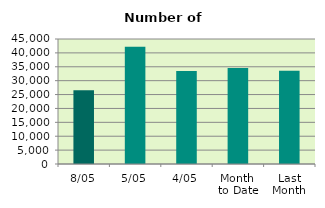
| Category | Series 0 |
|---|---|
| 8/05 | 26560 |
| 5/05 | 42244 |
| 4/05 | 33500 |
| Month 
to Date | 34549.2 |
| Last
Month | 33588.111 |